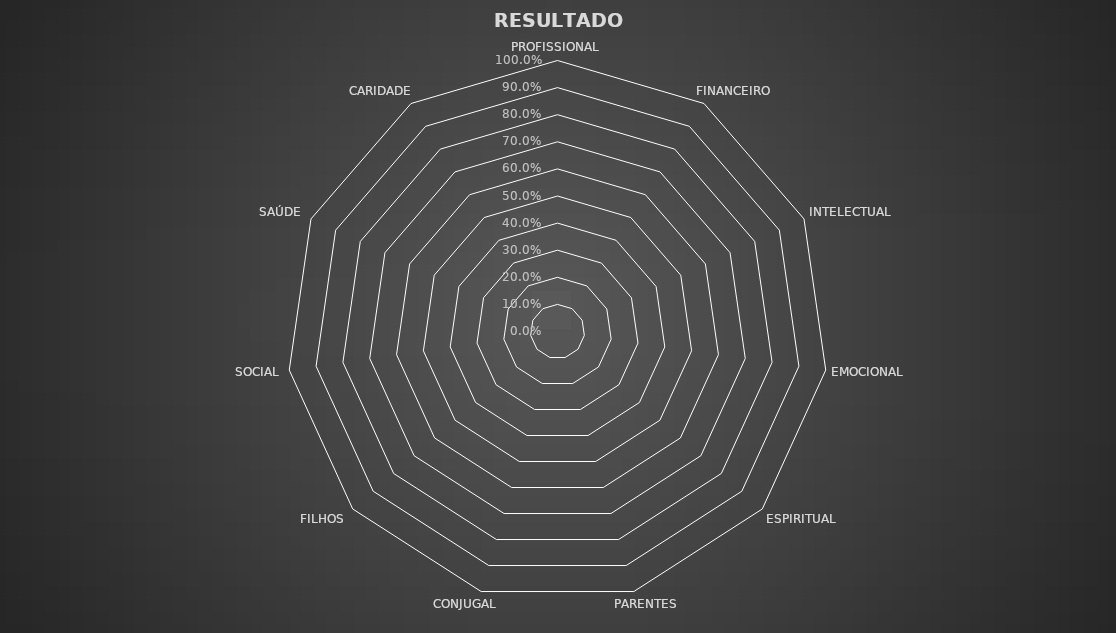
| Category | Series 0 |
|---|---|
| PROFISSIONAL | 0 |
| FINANCEIRO | 0 |
| INTELECTUAL | 0 |
| EMOCIONAL | 0 |
| ESPIRITUAL | 0 |
| PARENTES | 0 |
| CONJUGAL | 0 |
| FILHOS | 0 |
| SOCIAL | 0 |
| SAÚDE | 0 |
| CARIDADE | 0 |